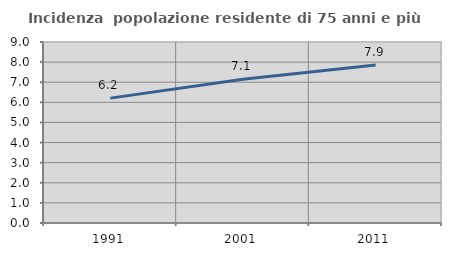
| Category | Incidenza  popolazione residente di 75 anni e più |
|---|---|
| 1991.0 | 6.209 |
| 2001.0 | 7.146 |
| 2011.0 | 7.858 |